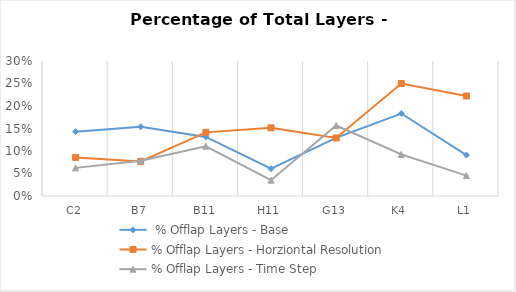
| Category |  % Offlap Layers - Base | % Offlap Layers - Horziontal Resolution | % Offlap Layers - Time Step |
|---|---|---|---|
| C2 | 0.143 | 0.086 | 0.062 |
| B7 | 0.154 | 0.077 | 0.078 |
| B11 | 0.131 | 0.141 | 0.111 |
| H11 | 0.061 | 0.152 | 0.035 |
| G13 | 0.129 | 0.129 | 0.157 |
| K4 | 0.183 | 0.25 | 0.092 |
| L1 | 0.091 | 0.222 | 0.045 |